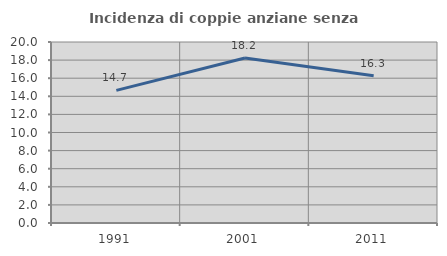
| Category | Incidenza di coppie anziane senza figli  |
|---|---|
| 1991.0 | 14.659 |
| 2001.0 | 18.238 |
| 2011.0 | 16.279 |